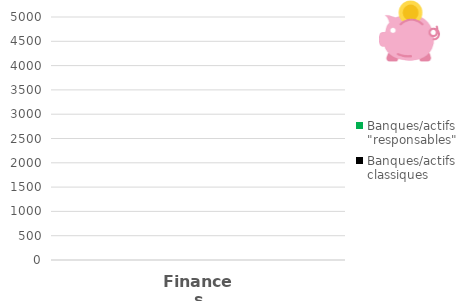
| Category | Banques/actifs classiques | Banques/actifs "responsables" |
|---|---|---|
| 0 | 0 | 0 |